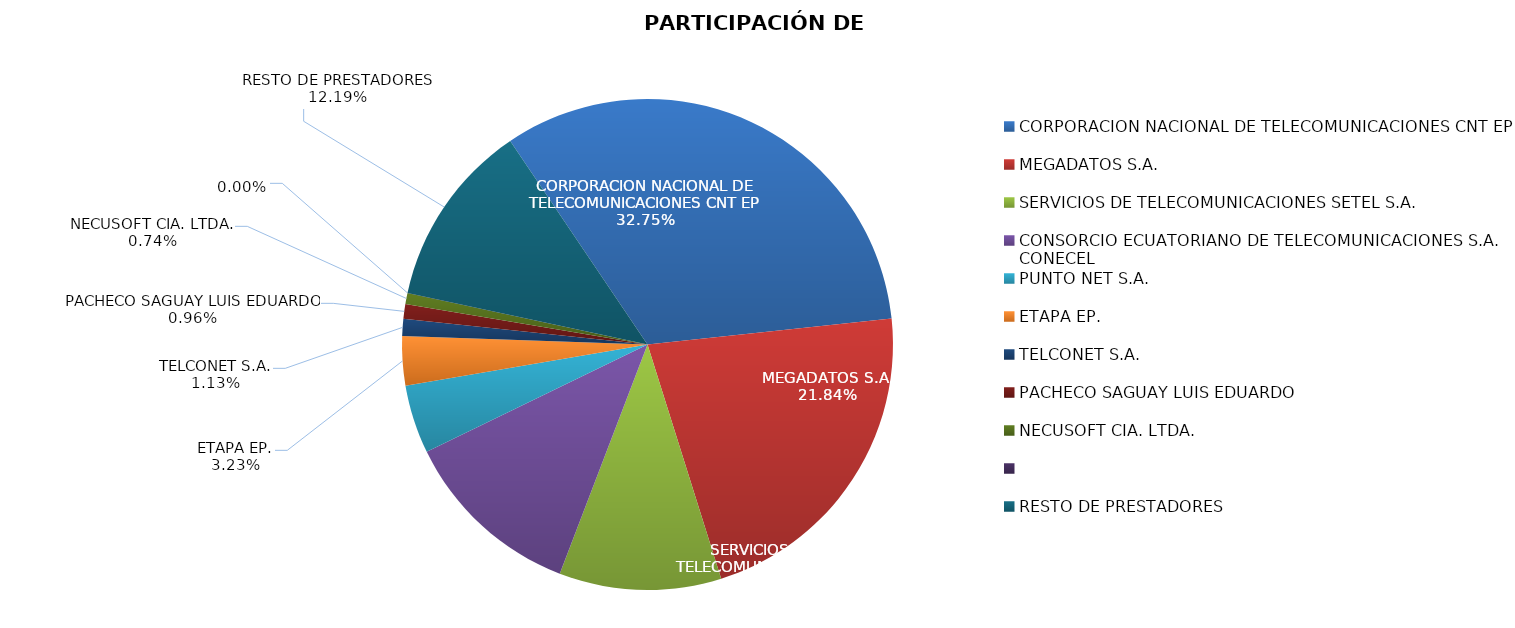
| Category | PARTICIPACIÓN DE MERCADO |
|---|---|
| CORPORACION NACIONAL DE TELECOMUNICACIONES CNT EP | 0.328 |
| MEGADATOS S.A. | 0.218 |
| SERVICIOS DE TELECOMUNICACIONES SETEL S.A. | 0.107 |
| CONSORCIO ECUATORIANO DE TELECOMUNICACIONES S.A. CONECEL | 0.12 |
| PUNTO NET S.A. | 0.045 |
| ETAPA EP. | 0.032 |
| TELCONET S.A. | 0.011 |
| PACHECO SAGUAY LUIS EDUARDO | 0.01 |
| NECUSOFT CIA. LTDA. | 0.007 |
|  | 0 |
| RESTO DE PRESTADORES | 0.122 |